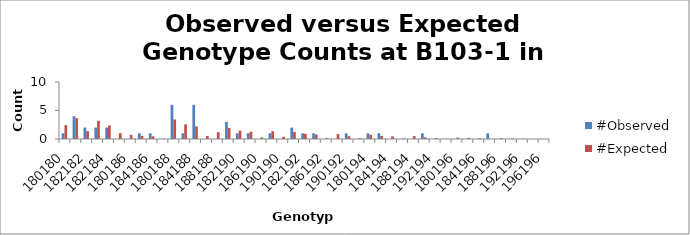
| Category | #Observed | #Expected |
|---|---|---|
| 180180.0 | 1 | 2.439 |
| 180182.0 | 4 | 3.659 |
| 182182.0 | 2 | 1.372 |
| 180184.0 | 2 | 3.171 |
| 182184.0 | 2 | 2.378 |
| 184184.0 | 0 | 1.03 |
| 180186.0 | 0 | 0.732 |
| 182186.0 | 1 | 0.549 |
| 184186.0 | 1 | 0.476 |
| 186186.0 | 0 | 0.055 |
| 180188.0 | 6 | 3.415 |
| 182188.0 | 1 | 2.561 |
| 184188.0 | 6 | 2.22 |
| 186188.0 | 0 | 0.512 |
| 188188.0 | 0 | 1.195 |
| 180190.0 | 3 | 1.951 |
| 182190.0 | 1 | 1.463 |
| 184190.0 | 1 | 1.268 |
| 186190.0 | 0 | 0.293 |
| 188190.0 | 1 | 1.366 |
| 190190.0 | 0 | 0.39 |
| 180192.0 | 2 | 1.22 |
| 182192.0 | 1 | 0.915 |
| 184192.0 | 1 | 0.793 |
| 186192.0 | 0 | 0.183 |
| 188192.0 | 0 | 0.854 |
| 190192.0 | 1 | 0.488 |
| 192192.0 | 0 | 0.152 |
| 180194.0 | 1 | 0.732 |
| 182194.0 | 1 | 0.549 |
| 184194.0 | 0 | 0.476 |
| 186194.0 | 0 | 0.11 |
| 188194.0 | 0 | 0.512 |
| 190194.0 | 1 | 0.293 |
| 192194.0 | 0 | 0.183 |
| 194194.0 | 0 | 0.055 |
| 180196.0 | 0 | 0.244 |
| 182196.0 | 0 | 0.183 |
| 184196.0 | 0 | 0.159 |
| 186196.0 | 1 | 0.037 |
| 188196.0 | 0 | 0.171 |
| 190196.0 | 0 | 0.098 |
| 192196.0 | 0 | 0.061 |
| 194196.0 | 0 | 0.037 |
| 196196.0 | 0 | 0.006 |